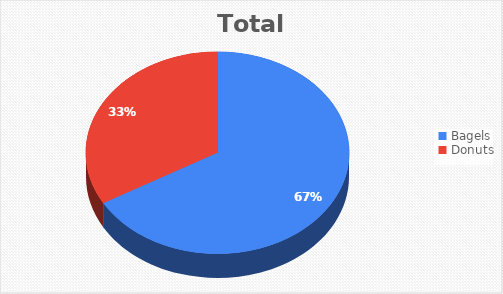
| Category | Total |
|---|---|
| Bagels | 6 |
| Donuts | 3 |